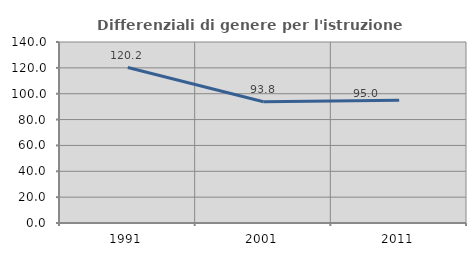
| Category | Differenziali di genere per l'istruzione superiore |
|---|---|
| 1991.0 | 120.225 |
| 2001.0 | 93.816 |
| 2011.0 | 94.973 |